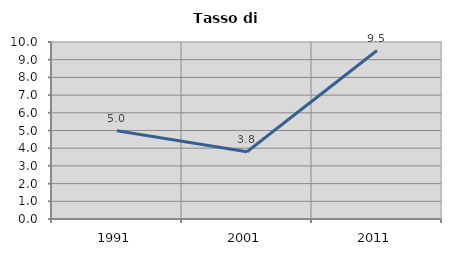
| Category | Tasso di disoccupazione   |
|---|---|
| 1991.0 | 4.99 |
| 2001.0 | 3.799 |
| 2011.0 | 9.519 |